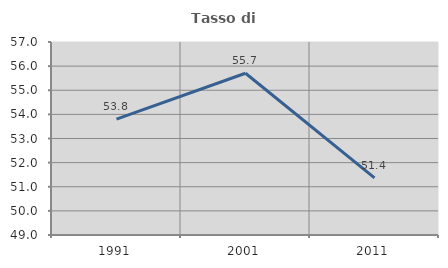
| Category | Tasso di occupazione   |
|---|---|
| 1991.0 | 53.806 |
| 2001.0 | 55.706 |
| 2011.0 | 51.37 |